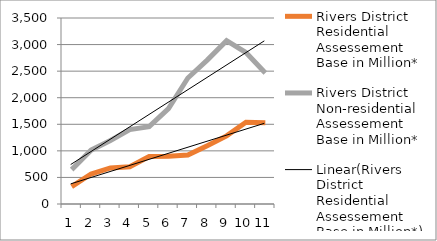
| Category | Rivers District Residential Assessement Base in Million* | Rivers District Non-residential Assessement Base in Million* |
|---|---|---|
| 0 | 328 | 647 |
| 1 | 564.272 | 1013.573 |
| 2 | 678.619 | 1193.954 |
| 3 | 700.663 | 1400.17 |
| 4 | 892.233 | 1454.989 |
| 5 | 900.574 | 1794.14 |
| 6 | 923.258 | 2370.324 |
| 7 | 1097.16 | 2707.639 |
| 8 | 1281.599 | 3072.763 |
| 9 | 1537.587 | 2850.617 |
| 10 | 1529.5 | 2464.319 |